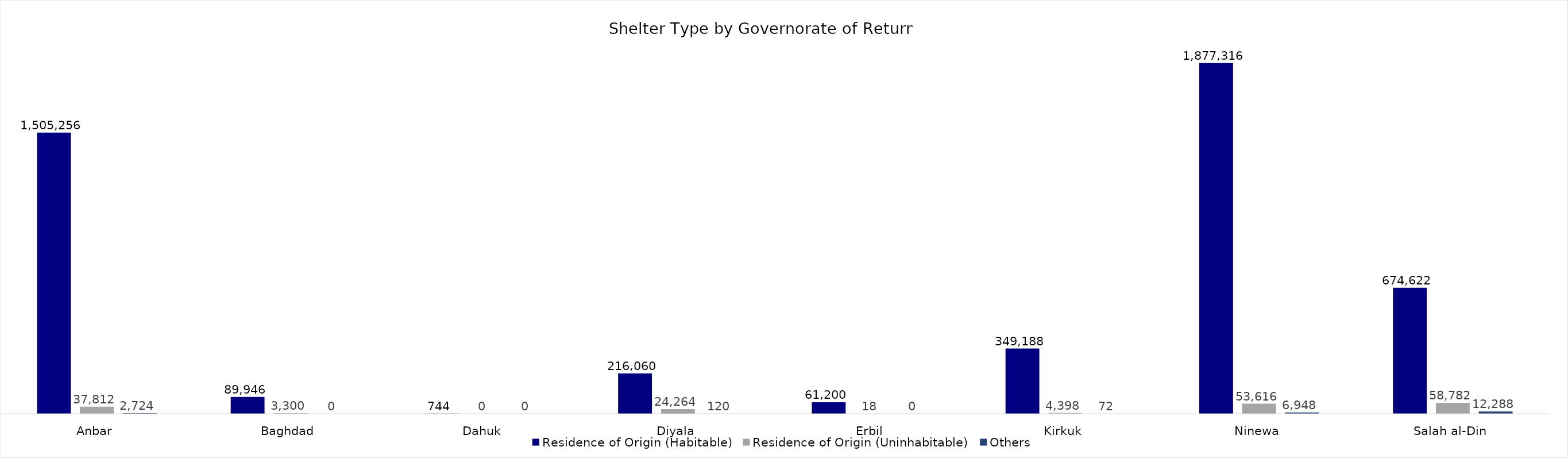
| Category | Residence of Origin (Habitable) | Residence of Origin (Uninhabitable) | Others |
|---|---|---|---|
| Anbar | 1505256 | 37812 | 2724 |
| Baghdad | 89946 | 3300 | 0 |
| Dahuk | 744 | 0 | 0 |
| Diyala | 216060 | 24264 | 120 |
| Erbil | 61200 | 18 | 0 |
| Kirkuk | 349188 | 4398 | 72 |
| Ninewa | 1877316 | 53616 | 6948 |
| Salah al-Din | 674622 | 58782 | 12288 |